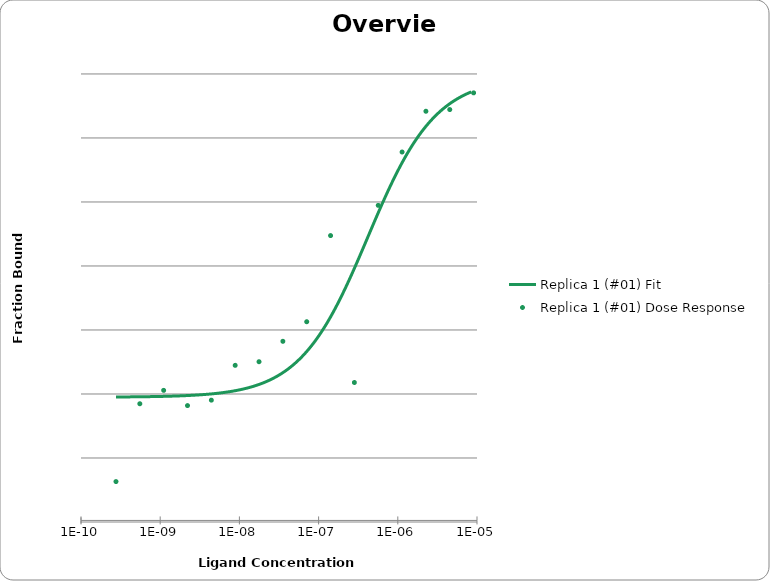
| Category | Replica 1 (#01) Fit |
|---|---|
| 8.45327885077503e-06 | 0.954 |
| 7.88718800540402e-06 | 0.951 |
| 7.35900657374926e-06 | 0.947 |
| 6.86619587556171e-06 | 0.944 |
| 6.40638723842876e-06 | 0.94 |
| 5.97737061285705e-06 | 0.936 |
| 5.57708394976917e-06 | 0.932 |
| 5.20360328935768e-06 | 0.927 |
| 4.85513351365901e-06 | 0.922 |
| 4.52999971839987e-06 | 0.917 |
| 4.2266391626453e-06 | 0.912 |
| 3.94359375755486e-06 | 0.906 |
| 3.67950305814425e-06 | 0.9 |
| 3.43309772436787e-06 | 0.893 |
| 3.20319342009302e-06 | 0.886 |
| 2.98868512064173e-06 | 0.879 |
| 2.78854180153938e-06 | 0.872 |
| 2.60180148294205e-06 | 0.864 |
| 2.42756660592374e-06 | 0.855 |
| 2.26499971839988e-06 | 0.846 |
| 2.11331944995156e-06 | 0.837 |
| 1.97179675620386e-06 | 0.827 |
| 1.83975141470695e-06 | 0.817 |
| 1.71654875547745e-06 | 0.807 |
| 1.60159661048584e-06 | 0.795 |
| 1.49434246742747e-06 | 0.784 |
| 1.39427081409709e-06 | 0.772 |
| 1.30090066060263e-06 | 0.759 |
| 1.21378322750899e-06 | 0.746 |
| 1.13249978879992e-06 | 0.733 |
| 1.05665965929023e-06 | 0.719 |
| 9.85898316815152e-07 | 0.704 |
| 9.19875650170886e-07 | 0.69 |
| 8.58274324385483e-07 | 0.674 |
| 8.00798255462587e-07 | 0.659 |
| 7.47171187267045e-07 | 0.643 |
| 6.97135363712249e-07 | 0.627 |
| 6.50450289867121e-07 | 0.61 |
| 6.0689157602806e-07 | 0.593 |
| 5.66249859199948e-07 | 0.576 |
| 5.28329796802346e-07 | 0.559 |
| 4.92949127764188e-07 | 0.542 |
| 4.59937796494151e-07 | 0.524 |
| 4.29137135516123e-07 | 0.507 |
| 4.00399102841129e-07 | 0.489 |
| 3.73585570410178e-07 | 0.472 |
| 3.48567660187978e-07 | 0.454 |
| 3.25225124716465e-07 | 0.437 |
| 3.03445769150813e-07 | 0.42 |
| 2.8312491199997e-07 | 0.403 |
| 2.64164881979789e-07 | 0.386 |
| 2.46474548560401e-07 | 0.37 |
| 2.29968883951431e-07 | 0.353 |
| 2.14568554419753e-07 | 0.337 |
| 2.00199538975483e-07 | 0.322 |
| 1.86792773593417e-07 | 0.307 |
| 1.74283819259916e-07 | 0.292 |
| 1.62612552249685e-07 | 0.278 |
| 1.51722875143798e-07 | 0.264 |
| 1.41562447199984e-07 | 0.251 |
| 1.32082432779203e-07 | 0.238 |
| 1.23237266619354e-07 | 0.225 |
| 1.14984434827893e-07 | 0.213 |
| 1.07284270540723e-07 | 0.202 |
| 1.00099763265201e-07 | 0.191 |
| 9.33963809908731e-08 | 0.18 |
| 8.71419042129221e-08 | 0.17 |
| 8.13062710705693e-08 | 0.161 |
| 7.58614328560955e-08 | 0.151 |
| 7.07812191999914e-08 | 0.143 |
| 6.6041212284256e-08 | 0.134 |
| 6.16186294792544e-08 | 0.127 |
| 5.74922138400358e-08 | 0.119 |
| 5.36421319357848e-08 | 0.112 |
| 5.00498785213304e-08 | 0.105 |
| 4.6698187592519e-08 | 0.099 |
| 4.35709493979432e-08 | 0.093 |
| 4.06531330081482e-08 | 0.087 |
| 3.79307140701461e-08 | 0.082 |
| 3.53906073999957e-08 | 0.077 |
| 3.30206040894554e-08 | 0.072 |
| 3.0809312824416e-08 | 0.067 |
| 2.87461051330626e-08 | 0.063 |
| 2.68210643006042e-08 | 0.059 |
| 2.50249377050303e-08 | 0.055 |
| 2.33490923448008e-08 | 0.052 |
| 2.17854733447128e-08 | 0.049 |
| 2.03265652405059e-08 | 0.045 |
| 1.89653558561223e-08 | 0.043 |
| 1.76953025999979e-08 | 0.04 |
| 1.65103010183914e-08 | 0.037 |
| 1.54046554546024e-08 | 0.035 |
| 1.43730516730537e-08 | 0.033 |
| 1.3410531316658e-08 | 0.03 |
| 1.25124680746977e-08 | 0.028 |
| 1.16745454466711e-08 | 0.027 |
| 1.0892735995227e-08 | 0.025 |
| 1.01632819884689e-08 | 0.023 |
| 9.48267733858577e-09 | 0.022 |
| 8.84765074999898e-09 | 0.02 |
| 8.25514999602762e-09 | 0.019 |
| 7.70232724849844e-09 | 0.018 |
| 7.18652538978809e-09 | 0.017 |
| 6.705265241507e-09 | 0.015 |
| 6.25623364844019e-09 | 0.014 |
| 5.83727236047092e-09 | 0.013 |
| 5.44636765904884e-09 | 0.013 |
| 5.08164067834246e-09 | 0.012 |
| 4.74133837455523e-09 | 0.011 |
| 4.42382509999954e-09 | 0.01 |
| 4.12757474142978e-09 | 0.01 |
| 3.85116338484786e-09 | 0.009 |
| 3.59326247152468e-09 | 0.008 |
| 3.35263241234251e-09 | 0.008 |
| 3.12811662976577e-09 | 0.007 |
| 2.91863599880316e-09 | 0.007 |
| 2.7231836602421e-09 | 0.006 |
| 2.54082018122524e-09 | 0.006 |
| 2.3706690399088e-09 | 0.006 |
| 2.2119124124998e-09 | 0.005 |
| 2.06378724242288e-09 | 0.005 |
| 1.92558157272325e-09 | 0.004 |
| 1.79663112407766e-09 | 0.004 |
| 1.67631610196577e-09 | 0.004 |
| 1.56405821765572e-09 | 0.004 |
| 1.45931790868543e-09 | 0.003 |
| 1.36159174547989e-09 | 0.003 |
| 1.27041001163963e-09 | 0.003 |
| 1.18533444626999e-09 | 0.003 |
| 1.10595613749992e-09 | 0.003 |
| 1.03189355706544e-09 | 0.002 |
| 9.62790726511293e-10 | 0.002 |
| 8.98315506196495e-10 | 0.002 |
| 8.38157998880143e-10 | 0.002 |
| 7.82029060214286e-10 | 0.002 |
| 7.29658908984647e-10 | 0.002 |
| 6.80795830419371e-10 | 0.002 |
| 6.35204966333321e-10 | 0.001 |
| 5.92667186292796e-10 | 0.001 |
| 5.52978034374971e-10 | 0.001 |
| 5.15946746459723e-10 | 0.001 |
| 4.81395333330482e-10 | 0.001 |
| 4.49157725177081e-10 | 0.001 |
| 4.19078973388703e-10 | 0.001 |
| 3.91014505800357e-10 | 0.001 |
| 3.6482943181329e-10 | 0.001 |
| 3.40397894049399e-10 | 0.001 |
| 3.17602463423415e-10 | 0.001 |
| 2.96333574725299e-10 | 0.001 |
| 2.76488999999992e-10 | 0.001 |